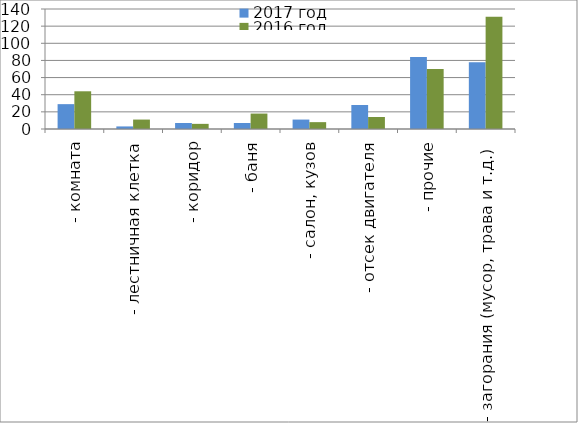
| Category | 2017 год | 2016 год |
|---|---|---|
|  - комната | 29 | 44 |
|  - лестничная клетка | 3 | 11 |
|  - коридор | 7 | 6 |
|  - баня | 7 | 18 |
|  - салон, кузов | 11 | 8 |
|  - отсек двигателя | 28 | 14 |
| - прочие | 84 | 70 |
| - загорания (мусор, трава и т.д.)  | 78 | 131 |